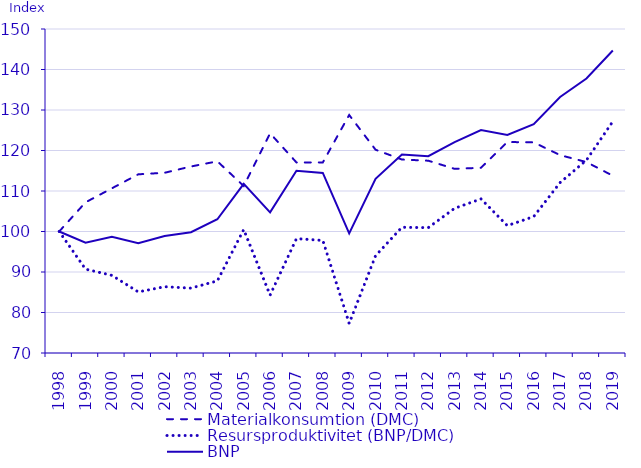
| Category | Materialkonsumtion (DMC) | Resursproduktivitet (BNP/DMC) | BNP |
|---|---|---|---|
| 1998.0 | 100 | 100 | 100 |
| 1999.0 | 107.205 | 90.706 | 97.241 |
| 2000.0 | 110.669 | 89.173 | 98.687 |
| 2001.0 | 114.118 | 85.08 | 97.091 |
| 2002.0 | 114.502 | 86.367 | 98.892 |
| 2003.0 | 116.054 | 86.014 | 99.823 |
| 2004.0 | 117.324 | 87.813 | 103.025 |
| 2005.0 | 111.24 | 100.472 | 111.765 |
| 2006.0 | 124.243 | 84.298 | 104.734 |
| 2007.0 | 117.051 | 98.243 | 114.994 |
| 2008.0 | 117.055 | 97.792 | 114.471 |
| 2009.0 | 128.766 | 77.306 | 99.544 |
| 2010.0 | 120.194 | 94.007 | 112.991 |
| 2011.0 | 117.77 | 101.046 | 119.002 |
| 2012.0 | 117.482 | 100.944 | 118.591 |
| 2013.0 | 115.472 | 105.73 | 122.089 |
| 2014.0 | 115.735 | 108.048 | 125.049 |
| 2015.0 | 122.095 | 101.443 | 123.857 |
| 2016.0 | 122.013 | 103.682 | 126.506 |
| 2017.0 | 118.856 | 112.068 | 133.201 |
| 2018.0 | 117.143 | 117.62 | 137.784 |
| 2019.0 | 113.771 | 127.173 | 144.686 |